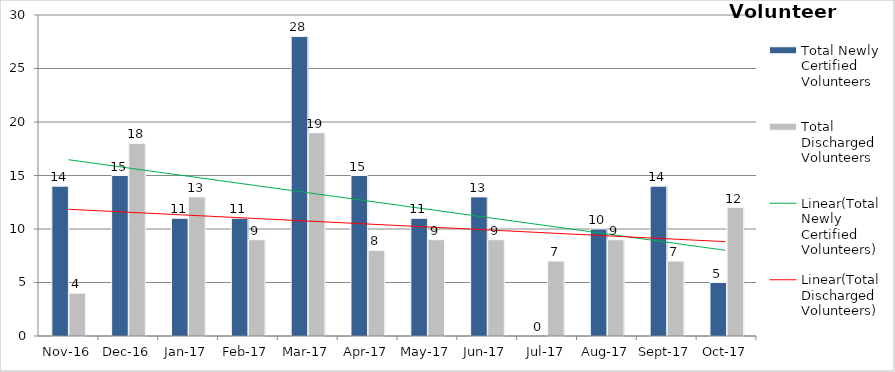
| Category | Total Newly Certified Volunteers | Total Discharged Volunteers |
|---|---|---|
| 2016-11-01 | 14 | 4 |
| 2016-12-01 | 15 | 18 |
| 2017-01-01 | 11 | 13 |
| 2017-02-01 | 11 | 9 |
| 2017-03-01 | 28 | 19 |
| 2017-04-01 | 15 | 8 |
| 2017-05-01 | 11 | 9 |
| 2017-06-01 | 13 | 9 |
| 2017-07-01 | 0 | 7 |
| 2017-08-01 | 10 | 9 |
| 2017-09-01 | 14 | 7 |
| 2017-10-01 | 5 | 12 |